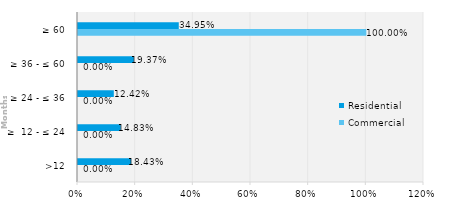
| Category | Commercial | Residential |
|---|---|---|
| >12 | 0 | 0.184 |
| ≥  12 - ≤ 24 | 0 | 0.148 |
| ≥ 24 - ≤ 36 | 0 | 0.124 |
| ≥ 36 - ≤ 60 | 0 | 0.194 |
| ≥ 60 | 1 | 0.35 |